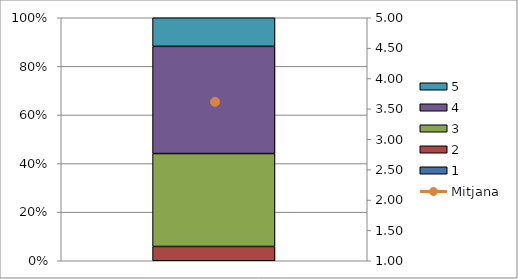
| Category | 1 | 2 | 3 | 4 | 5 |
|---|---|---|---|---|---|
| 0 | 0 | 2 | 13 | 15 | 4 |